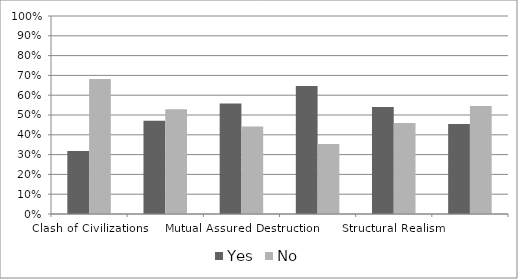
| Category | Yes | No |
|---|---|---|
| Clash of Civilizations | 0.318 | 0.682 |
| Democratic Peace Theory | 0.472 | 0.528 |
| Mutual Assured Destruction | 0.558 | 0.442 |
| Population Centric COIN | 0.647 | 0.353 |
| Structural Realism | 0.54 | 0.46 |
| Expected Utility | 0.455 | 0.545 |